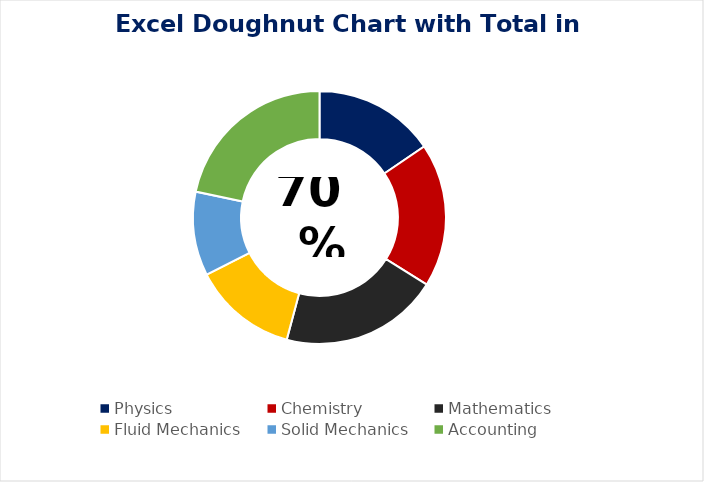
| Category | Series 0 |
|---|---|
| Physics | 0.65 |
| Chemistry | 0.77 |
| Mathematics | 0.85 |
| Fluid Mechanics | 0.56 |
| Solid Mechanics | 0.45 |
| Accounting | 0.91 |